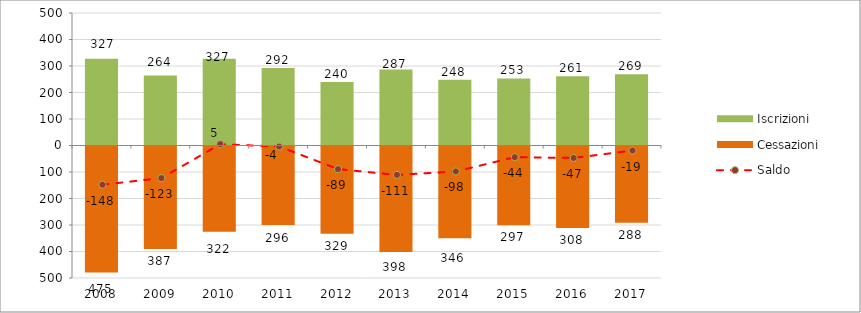
| Category | Iscrizioni | Cessazioni |
|---|---|---|
| 2008.0 | 327 | -475 |
| 2009.0 | 264 | -387 |
| 2010.0 | 327 | -322 |
| 2011.0 | 292 | -296 |
| 2012.0 | 240 | -329 |
| 2013.0 | 287 | -398 |
| 2014.0 | 248 | -346 |
| 2015.0 | 253 | -297 |
| 2016.0 | 261 | -308 |
| 2017.0 | 269 | -288 |